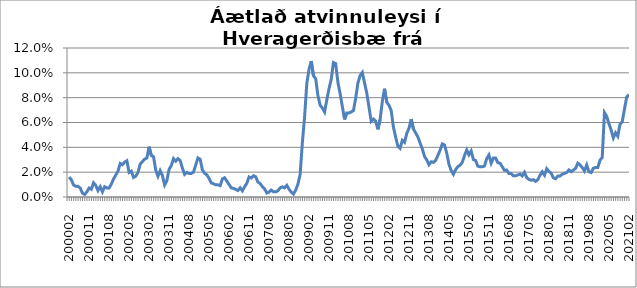
| Category | Series 0 |
|---|---|
| 200002 | 0.016 |
| 200003 | 0.014 |
| 200004 | 0.01 |
| 200005 | 0.009 |
| 200006 | 0.009 |
| 200007 | 0.007 |
| 200008 | 0.003 |
| 200009 | 0.002 |
| 200010 | 0.004 |
| 200011 | 0.007 |
| 200012 | 0.006 |
| 200101 | 0.011 |
| 200102 | 0.009 |
| 200103 | 0.005 |
| 200104 | 0.008 |
| 200105 | 0.004 |
| 200106 | 0.008 |
| 200107 | 0.007 |
| 200108 | 0.007 |
| 200109 | 0.01 |
| 200110 | 0.015 |
| 200111 | 0.018 |
| 200112 | 0.021 |
| 200201 | 0.027 |
| 200202 | 0.026 |
| 200203 | 0.028 |
| 200204 | 0.029 |
| 200205 | 0.02 |
| 200206 | 0.021 |
| 200207 | 0.016 |
| 200208 | 0.017 |
| 200209 | 0.02 |
| 200210 | 0.027 |
| 200211 | 0.029 |
| 200212 | 0.031 |
| 200301 | 0.031 |
| 200302 | 0.041 |
| 200303 | 0.033 |
| 200304 | 0.032 |
| 200305 | 0.022 |
| 200306 | 0.017 |
| 200307 | 0.021 |
| 200308 | 0.017 |
| 200309 | 0.01 |
| 200310 | 0.013 |
| 200311 | 0.022 |
| 200312 | 0.025 |
| 200401 | 0.031 |
| 200402 | 0.029 |
| 200403 | 0.031 |
| 200404 | 0.029 |
| 200405 | 0.023 |
| 200406 | 0.018 |
| 200407 | 0.02 |
| 200408 | 0.019 |
| 200409 | 0.019 |
| 200410 | 0.02 |
| 200411 | 0.026 |
| 200412 | 0.031 |
| 200501 | 0.03 |
| 200502 | 0.022 |
| 200503 | 0.019 |
| 200504 | 0.018 |
| 200505 | 0.015 |
| 200506 | 0.011 |
| 200507 | 0.011 |
| 200508 | 0.01 |
| 200509 | 0.01 |
| 200510 | 0.009 |
| 200511 | 0.015 |
| 200512 | 0.016 |
| 200601 | 0.013 |
| 200602 | 0.01 |
| 200603 | 0.007 |
| 200604 | 0.007 |
| 200605 | 0.006 |
| 200606 | 0.005 |
| 200607 | 0.007 |
| 200608 | 0.005 |
| 200609 | 0.008 |
| 200610 | 0.011 |
| 200611 | 0.016 |
| 200612 | 0.015 |
| 200701 | 0.017 |
| 200702 | 0.016 |
| 200703 | 0.012 |
| 200704 | 0.011 |
| 200705 | 0.008 |
| 200706 | 0.007 |
| 200707 | 0.003 |
| 200708 | 0.004 |
| 200709 | 0.006 |
| 200710 | 0.004 |
| 200711 | 0.004 |
| 200712 | 0.005 |
| 200801 | 0.007 |
| 200802 | 0.008 |
| 200803 | 0.007 |
| 200804 | 0.009 |
| 200805 | 0.006 |
| 200806 | 0.004 |
| 200807 | 0.002 |
| 200808 | 0.006 |
| 200809 | 0.01 |
| 200810 | 0.018 |
| 200811 | 0.044 |
| 200812 | 0.064 |
| 200901 | 0.092 |
| 200902 | 0.103 |
| 200903 | 0.109 |
| 200904 | 0.098 |
| 200905 | 0.095 |
| 200906 | 0.082 |
| 200907 | 0.074 |
| 200908 | 0.072 |
| 200909 | 0.068 |
| 200910 | 0.078 |
| 200911 | 0.087 |
| 200912 | 0.095 |
| 201001 | 0.108 |
| 201002 | 0.107 |
| 201003 | 0.092 |
| 201004 | 0.083 |
| 201005 | 0.073 |
| 201006 | 0.062 |
| 201007 | 0.068 |
| 201008 | 0.068 |
| 201009 | 0.068 |
| 201010 | 0.07 |
| 201011 | 0.079 |
| 201012 | 0.092 |
| 201101 | 0.098 |
| 201102 | 0.1 |
| 201103 | 0.092 |
| 201104 | 0.084 |
| 201105 | 0.072 |
| 201106 | 0.061 |
| 201107 | 0.063 |
| 201108 | 0.061 |
| 201109 | 0.055 |
| 201110 | 0.062 |
| 201111 | 0.077 |
| 201112 | 0.087 |
| 201201 | 0.076 |
| 201202 | 0.074 |
| 201203 | 0.07 |
| 201204 | 0.056 |
| 201205 | 0.048 |
| 201206 | 0.041 |
| 201207 | 0.039 |
| 201208 | 0.046 |
| 201209 | 0.044 |
| 201210 | 0.051 |
| 201211 | 0.055 |
| 201212 | 0.063 |
| 201301 | 0.055 |
| 201302 | 0.052 |
| 201303 | 0.048 |
| 201304 | 0.044 |
| 201305 | 0.039 |
| 201306 | 0.033 |
| 201307 | 0.03 |
| 201308 | 0.026 |
| 201309 | 0.028 |
| 201310 | 0.028 |
| 201311 | 0.029 |
| 201312 | 0.033 |
| 201401 | 0.038 |
| 201402 | 0.043 |
| 201403 | 0.042 |
| 201404 | 0.035 |
| 201405 | 0.026 |
| 201406 | 0.021 |
| 201407 | 0.018 |
| 201408 | 0.022 |
| 201409 | 0.024 |
| 201410 | 0.026 |
| 201411 | 0.028 |
| 201412 | 0.033 |
| 201501 | 0.038 |
| 201502 | 0.034 |
| 201503 | 0.037 |
| 201504 | 0.03 |
| 201505 | 0.029 |
| 201506 | 0.025 |
| 201507 | 0.024 |
| 201508 | 0.024 |
| 201509 | 0.025 |
| 201510 | 0.031 |
| 201511 | 0.034 |
| 201512 | 0.027 |
| 201601 | 0.031 |
| 201602 | 0.031 |
| 201603 | 0.028 |
| 201604 | 0.027 |
| 201605 | 0.024 |
| 201606 | 0.021 |
| 201607 | 0.022 |
| 201608 | 0.019 |
| 201609 | 0.019 |
| 201610 | 0.017 |
| 201611 | 0.017 |
| 201612 | 0.018 |
| 201701 | 0.018 |
| 201702 | 0.017 |
| 201703 | 0.02 |
| 201704 | 0.016 |
| 201705 | 0.014 |
| 201706 | 0.013 |
| 201707 | 0.014 |
| 201708 | 0.013 |
| 201709 | 0.014 |
| 201710 | 0.018 |
| 201711 | 0.02 |
| 201712 | 0.018 |
| 201801 | 0.023 |
| 201802 | 0.021 |
| 201803 | 0.019 |
| 201804 | 0.015 |
| 201805 | 0.015 |
| 201806 | 0.017 |
| 201807 | 0.017 |
| 201808 | 0.018 |
| 201809 | 0.019 |
| 201810 | 0.02 |
| 201811 | 0.022 |
| 201812 | 0.02 |
| 201901 | 0.022 |
| 201902 | 0.023 |
| 201903 | 0.027 |
| 201904 | 0.026 |
| 201905 | 0.024 |
| 201906 | 0.021 |
| 201907 | 0.026 |
| 201908 | 0.02 |
| 201909 | 0.02 |
| 201910 | 0.023 |
| 201911 | 0.024 |
| 201912 | 0.024 |
| 202001 | 0.03 |
| 202002 | 0.032 |
| 202003 | 0.068 |
| 202004 | 0.065 |
| 202005 | 0.059 |
| 202006 | 0.054 |
| 202007 | 0.048 |
| 202008 | 0.052 |
| 202009 | 0.049 |
| 202010 | 0.059 |
| 202011 | 0.061 |
| 202012 | 0.071 |
| 202101 | 0.08 |
| 202102 | 0.083 |